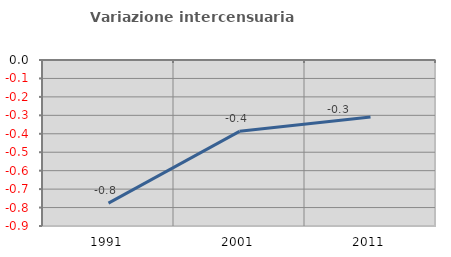
| Category | Variazione intercensuaria annua |
|---|---|
| 1991.0 | -0.776 |
| 2001.0 | -0.387 |
| 2011.0 | -0.309 |